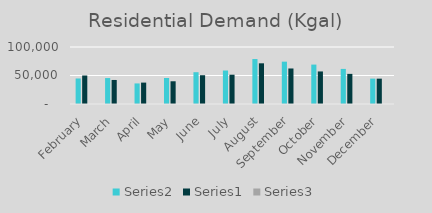
| Category | Series 1 | Series 0 | Series 2 |
|---|---|---|---|
| February | 44769 | 49996 | 0.895 |
| March | 45502 | 42168 | 1.079 |
| April | 36081 | 37537 | 0.961 |
| May | 45570 | 39883 | 1.143 |
| June | 55783 | 50498 | 1.105 |
| July | 58740 | 51383 | 1.143 |
| August | 78887 | 71400 | 1.105 |
| September | 74265 | 62313 | 1.192 |
| October | 69149 | 57107 | 1.211 |
| November | 61557 | 52844 | 1.165 |
| December | 44527 | 44458 | 1.002 |